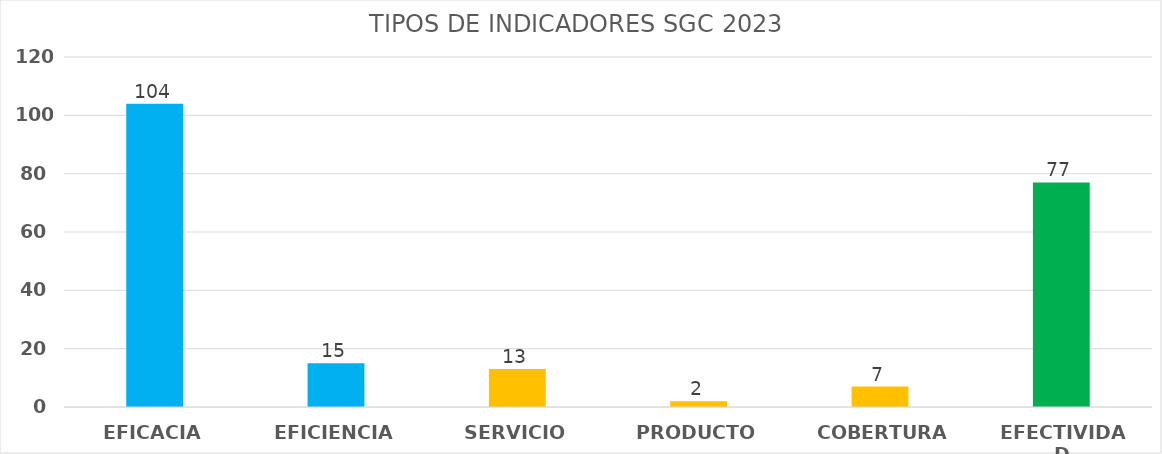
| Category | Series 0 |
|---|---|
| EFICACIA | 104 |
| EFICIENCIA | 15 |
| SERVICIO | 13 |
| PRODUCTO | 2 |
| COBERTURA | 7 |
| EFECTIVIDAD | 77 |